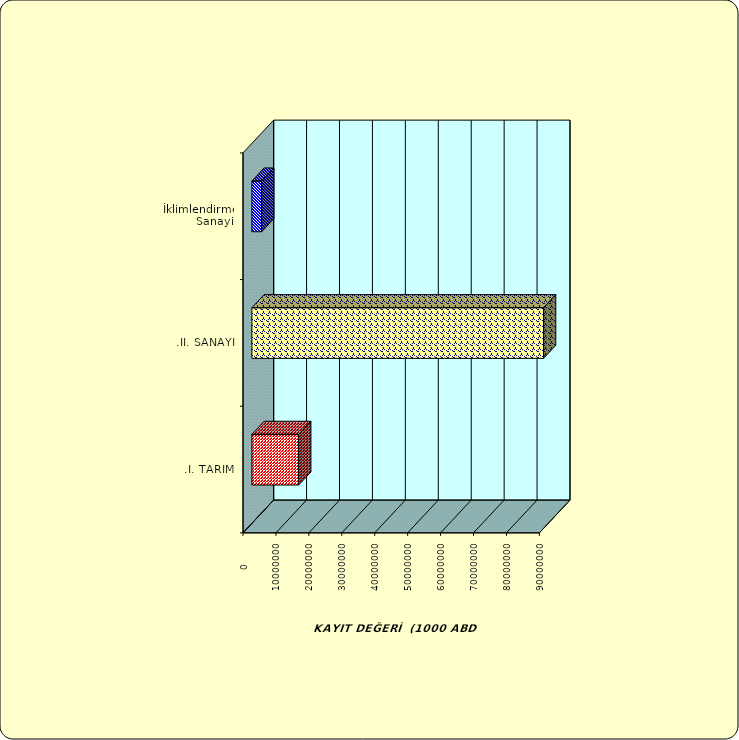
| Category | Series 0 |
|---|---|
| .I. TARIM | 14212842.406 |
| .II. SANAYİ | 88575525.071 |
|  İklimlendirme Sanayii | 2975833.627 |